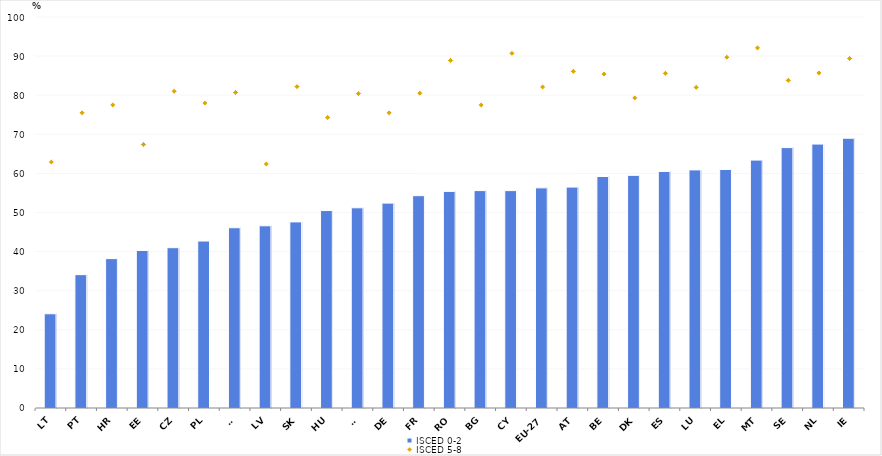
| Category | ISCED 0-2 |
|---|---|
| LT | 24.1 |
| PT | 34.1 |
| HR | 38.2 |
| EE | 40.3 |
| CZ | 41 |
| PL | 42.7 |
| SI | 46.1 |
| LV | 46.6 |
| SK | 47.6 |
| HU | 50.5 |
| FI | 51.2 |
| DE | 52.4 |
| FR | 54.3 |
| RO | 55.4 |
| BG | 55.6 |
| CY | 55.6 |
| EU-27 | 56.3 |
| AT | 56.5 |
| BE | 59.2 |
| DK | 59.5 |
| ES | 60.5 |
| LU | 60.9 |
| EL | 61 |
| MT | 63.4 |
| SE | 66.6 |
| NL | 67.5 |
| IE | 69 |